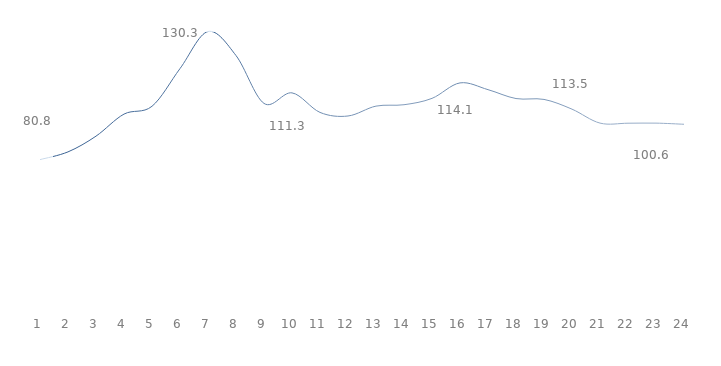
| Category | Número índice de base fixa |
|---|---|
| 0 | 80.754 |
| 1 | 84.964 |
| 2 | 93.528 |
| 3 | 105.527 |
| 4 | 109.786 |
| 5 | 130.301 |
| 6 | 150.469 |
| 7 | 137.391 |
| 8 | 111.345 |
| 9 | 117.079 |
| 10 | 106.441 |
| 11 | 104.493 |
| 12 | 109.872 |
| 13 | 110.626 |
| 14 | 114.086 |
| 15 | 122.507 |
| 16 | 118.828 |
| 17 | 113.987 |
| 18 | 113.514 |
| 19 | 108.208 |
| 20 | 100.623 |
| 21 | 100.564 |
| 22 | 100.612 |
| 23 | 99.992 |